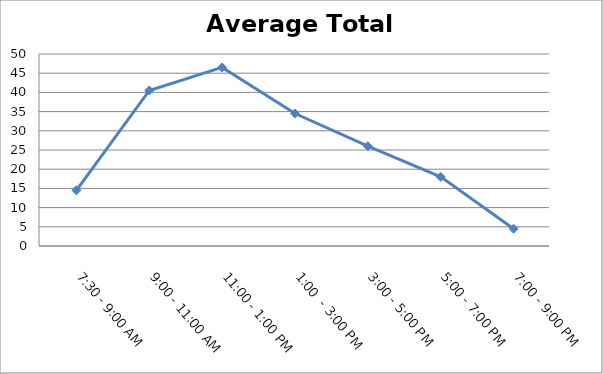
| Category | Total |
|---|---|
| 7:30 - 9:00 AM | 14.5 |
| 9:00 - 11:00 AM | 40.5 |
| 11:00 - 1:00 PM | 46.5 |
| 1:00  - 3:00 PM | 34.5 |
| 3:00 - 5:00 PM | 26 |
| 5:00 - 7:00 PM | 18 |
| 7:00 - 9:00 PM | 4.5 |